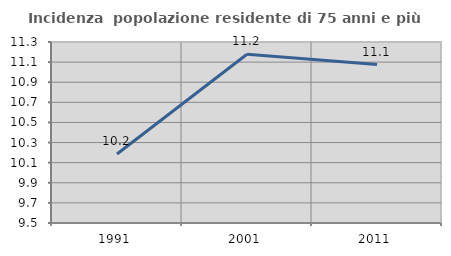
| Category | Incidenza  popolazione residente di 75 anni e più |
|---|---|
| 1991.0 | 10.187 |
| 2001.0 | 11.178 |
| 2011.0 | 11.076 |